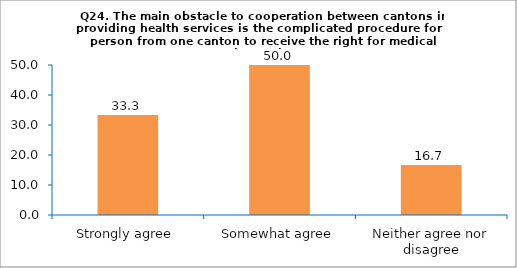
| Category | Series 0 |
|---|---|
| Strongly agree | 33.333 |
| Somewhat agree | 50 |
| Neither agree nor disagree | 16.667 |